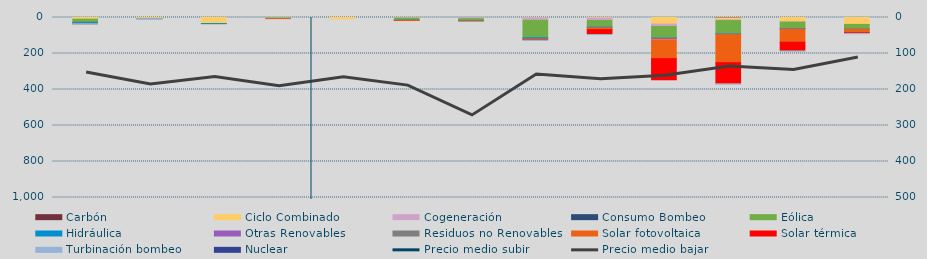
| Category | Carbón | Ciclo Combinado | Cogeneración | Consumo Bombeo | Eólica | Hidráulica | Otras Renovables | Residuos no Renovables | Solar fotovoltaica | Solar térmica | Turbinación bombeo | Nuclear |
|---|---|---|---|---|---|---|---|---|---|---|---|---|
| 0 | 0 | 9373.3 | 187.6 | 0 | 17462.5 | 7049 | 0 | 0 | 881.5 | 0 | 630 | 0 |
| 1 | 0 | 4799.8 | 0 | 0 | 1194.5 | 10 | 0 | 0 | 206.3 | 0 | 3200 | 0 |
| 2 | 0 | 33709.9 | 8 | 0 | 110.5 | 209.5 | 0 | 0 | 0 | 0 | 0 | 0 |
| 3 | 0 | 3930.7 | 0 | 0 | 149.1 | 1762.1 | 0 | 0 | 18.8 | 0 | 0 | 0 |
| 4 | 0 | 7388.9 | 0 | 0 | 0 | 0 | 0 | 0 | 0 | 0 | 0 | 0 |
| 5 | 0 | 582 | 2829.7 | 0 | 11683.6 | 231.6 | 1182.5 | 0 | 155.2 | 1067.3 | 0 | 0 |
| 6 | 0 | 0 | 6237.3 | 0 | 10203.7 | 1917.8 | 944.6 | 0 | 48.1 | 0 | 0 | 0 |
| 7 | 0 | 1230 | 13598.7 | 0 | 97489.7 | 5402.7 | 1813.8 | 1013 | 3586.5 | 2430.1 | 317.4 | 0 |
| 8 | 0 | 3090.6 | 13474.7 | 0 | 37149 | 1123.6 | 3207.9 | 675 | 8550.9 | 27054.6 | 431 | 0 |
| 9 | 0 | 36734.9 | 12855.2 | 0 | 65071.5 | 1518 | 6583 | 675 | 105142.4 | 122842 | 0 | 0 |
| 10 | 2096 | 11203.8 | 3780.2 | 0 | 74938.3 | 359.9 | 3182.9 | 0 | 155352.2 | 119223.3 | 200 | 0 |
| 11 | 0 | 23416.9 | 1799.3 | 0 | 36710.1 | 169.9 | 2791.7 | 130.2 | 72190.6 | 49997.5 | 140 | 0 |
| 12 | 0 | 38168.9 | 488.4 | 0 | 26054.9 | 21.9 | 466.4 | 0 | 19329.3 | 4158.9 | 1184.2 | 0 |